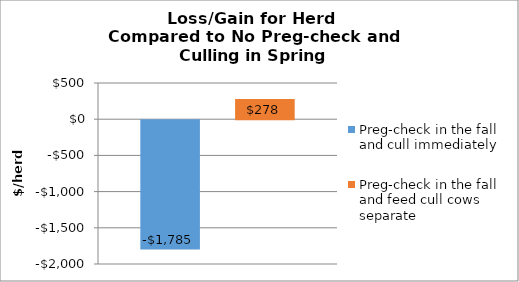
| Category | Preg-check in the fall and cull immediately | Preg-check in the fall and feed cull cows separate |
|---|---|---|
| 0 | -1785.332 | 278.213 |